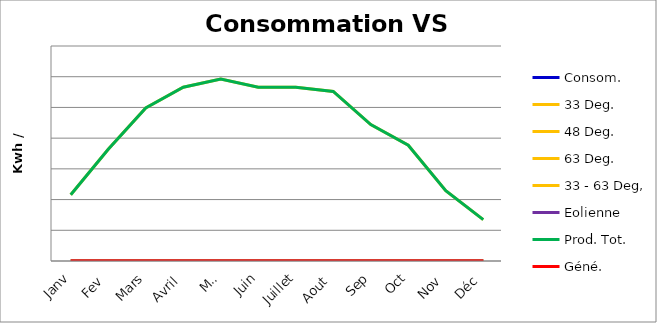
| Category | Consom. | 33 Deg. | 48 Deg. | 63 Deg. | 33 - 63 Deg, | Eolienne | Prod. Tot. | Géné. |
|---|---|---|---|---|---|---|---|---|
| Janv | 0 | 0 | 0 | 43.092 | 0 | 0 | 43.092 | 0 |
| Fev | 0 | 0 | 0 | 72.718 | 0 | 0 | 72.718 | 0 |
| Mars | 0 | 0 | 0 | 99.65 | 0 | 0 | 99.65 | 0 |
| Avril | 0 | 0 | 0 | 113.116 | 0 | 0 | 113.116 | 0 |
| Mai | 0 | 0 | 0 | 118.503 | 0 | 0 | 118.503 | 0 |
| Juin | 0 | 0 | 0 | 113.116 | 0 | 0 | 113.116 | 0 |
| Juillet | 0 | 0 | 0 | 113.116 | 0 | 0 | 113.116 | 0 |
| Aout | 0 | 0 | 0 | 110.423 | 0 | 0 | 110.423 | 0 |
| Sep | 0 | 0 | 0 | 88.877 | 0 | 0 | 88.877 | 0 |
| Oct | 0 | 0 | 0 | 75.411 | 0 | 0 | 75.411 | 0 |
| Nov | 0 | 0 | 0 | 45.785 | 0 | 0 | 45.785 | 0 |
| Déc | 0 | 0 | 0 | 26.932 | 0 | 0 | 26.932 | 0 |